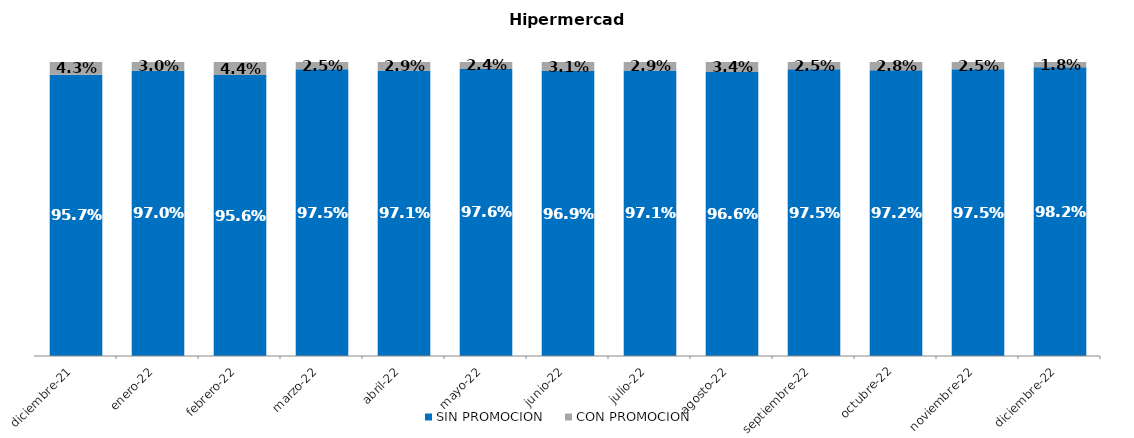
| Category | SIN PROMOCION   | CON PROMOCION   |
|---|---|---|
| 2021-12-01 | 0.957 | 0.043 |
| 2022-01-01 | 0.97 | 0.03 |
| 2022-02-01 | 0.956 | 0.044 |
| 2022-03-01 | 0.975 | 0.025 |
| 2022-04-01 | 0.971 | 0.029 |
| 2022-05-01 | 0.976 | 0.024 |
| 2022-06-01 | 0.969 | 0.031 |
| 2022-07-01 | 0.971 | 0.029 |
| 2022-08-01 | 0.966 | 0.034 |
| 2022-09-01 | 0.975 | 0.025 |
| 2022-10-01 | 0.972 | 0.028 |
| 2022-11-01 | 0.975 | 0.025 |
| 2022-12-01 | 0.982 | 0.018 |